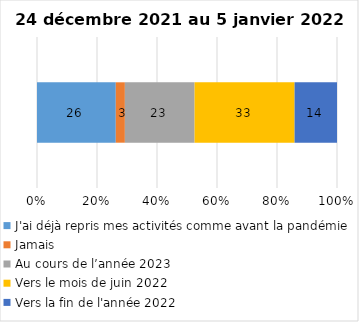
| Category | J'ai déjà repris mes activités comme avant la pandémie | Jamais | Au cours de l’année 2023 | Vers le mois de juin 2022 | Vers la fin de l'année 2022 |
|---|---|---|---|---|---|
| 0 | 26 | 3 | 23 | 33 | 14 |